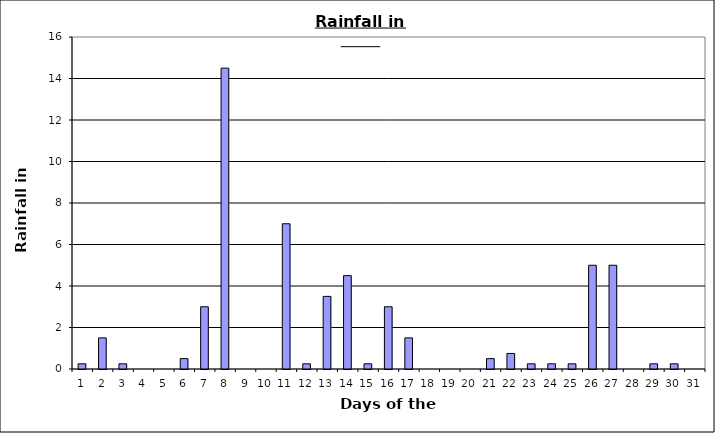
| Category | Series 0 |
|---|---|
| 0 | 0.25 |
| 1 | 1.5 |
| 2 | 0.25 |
| 3 | 0 |
| 4 | 0 |
| 5 | 0.5 |
| 6 | 3 |
| 7 | 14.5 |
| 8 | 0 |
| 9 | 0 |
| 10 | 7 |
| 11 | 0.25 |
| 12 | 3.5 |
| 13 | 4.5 |
| 14 | 0.25 |
| 15 | 3 |
| 16 | 1.5 |
| 17 | 0 |
| 18 | 0 |
| 19 | 0 |
| 20 | 0.5 |
| 21 | 0.75 |
| 22 | 0.25 |
| 23 | 0.25 |
| 24 | 0.25 |
| 25 | 5 |
| 26 | 5 |
| 27 | 0 |
| 28 | 0.25 |
| 29 | 0.25 |
| 30 | 0 |